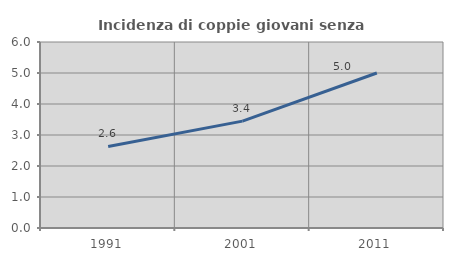
| Category | Incidenza di coppie giovani senza figli |
|---|---|
| 1991.0 | 2.632 |
| 2001.0 | 3.448 |
| 2011.0 | 5 |